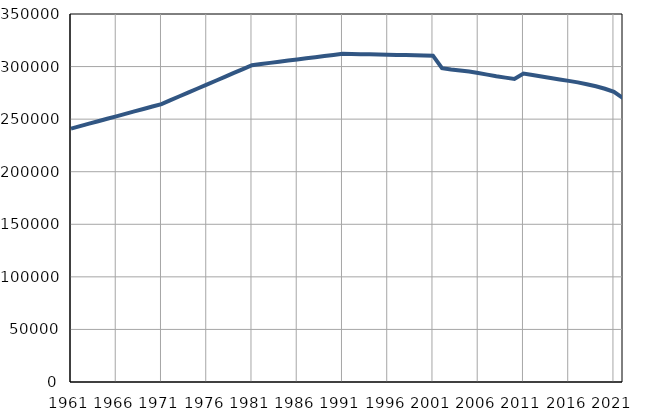
| Category | Број
становника |
|---|---|
| 1961.0 | 241047 |
| 1962.0 | 243377 |
| 1963.0 | 245706 |
| 1964.0 | 248036 |
| 1965.0 | 250366 |
| 1966.0 | 252696 |
| 1967.0 | 255025 |
| 1968.0 | 257355 |
| 1969.0 | 259685 |
| 1970.0 | 262014 |
| 1971.0 | 264344 |
| 1972.0 | 268045 |
| 1973.0 | 271746 |
| 1974.0 | 275447 |
| 1975.0 | 279147 |
| 1976.0 | 282849 |
| 1977.0 | 286550 |
| 1978.0 | 290251 |
| 1979.0 | 293952 |
| 1980.0 | 297653 |
| 1981.0 | 301354 |
| 1982.0 | 302435 |
| 1983.0 | 303515 |
| 1984.0 | 304596 |
| 1985.0 | 305676 |
| 1986.0 | 306757 |
| 1987.0 | 307838 |
| 1988.0 | 308918 |
| 1989.0 | 309999 |
| 1990.0 | 311079 |
| 1991.0 | 312160 |
| 1992.0 | 311984 |
| 1993.0 | 311807 |
| 1994.0 | 311631 |
| 1995.0 | 311455 |
| 1996.0 | 311279 |
| 1997.0 | 311102 |
| 1998.0 | 310926 |
| 1999.0 | 310750 |
| 2000.0 | 310574 |
| 2001.0 | 310397 |
| 2002.0 | 298527 |
| 2003.0 | 297132 |
| 2004.0 | 296223 |
| 2005.0 | 295241 |
| 2006.0 | 293869 |
| 2007.0 | 292340 |
| 2008.0 | 290806 |
| 2009.0 | 289496 |
| 2010.0 | 288151 |
| 2011.0 | 293422 |
| 2012.0 | 292035 |
| 2013.0 | 290541 |
| 2014.0 | 289175 |
| 2015.0 | 287784 |
| 2016.0 | 286406 |
| 2017.0 | 284957 |
| 2018.0 | 283235 |
| 2019.0 | 281277 |
| 2020.0 | 278917 |
| 2021.0 | 275944 |
| 2022.0 | 270085 |